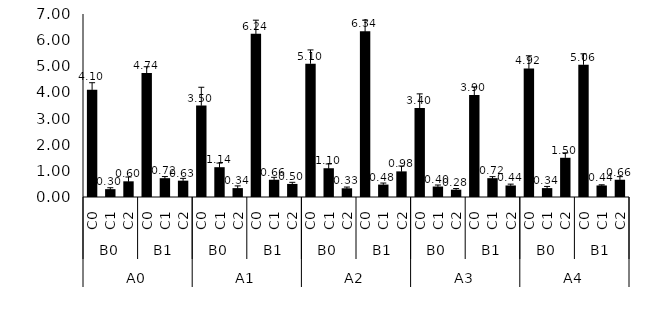
| Category | Series 0 |
|---|---|
| 0 | 4.1 |
| 1 | 0.3 |
| 2 | 0.6 |
| 3 | 4.74 |
| 4 | 0.72 |
| 5 | 0.625 |
| 6 | 3.5 |
| 7 | 1.14 |
| 8 | 0.34 |
| 9 | 6.24 |
| 10 | 0.66 |
| 11 | 0.5 |
| 12 | 5.1 |
| 13 | 1.1 |
| 14 | 0.333 |
| 15 | 6.34 |
| 16 | 0.475 |
| 17 | 0.98 |
| 18 | 3.4 |
| 19 | 0.4 |
| 20 | 0.28 |
| 21 | 3.9 |
| 22 | 0.72 |
| 23 | 0.44 |
| 24 | 4.92 |
| 25 | 0.34 |
| 26 | 1.5 |
| 27 | 5.06 |
| 28 | 0.44 |
| 29 | 0.66 |